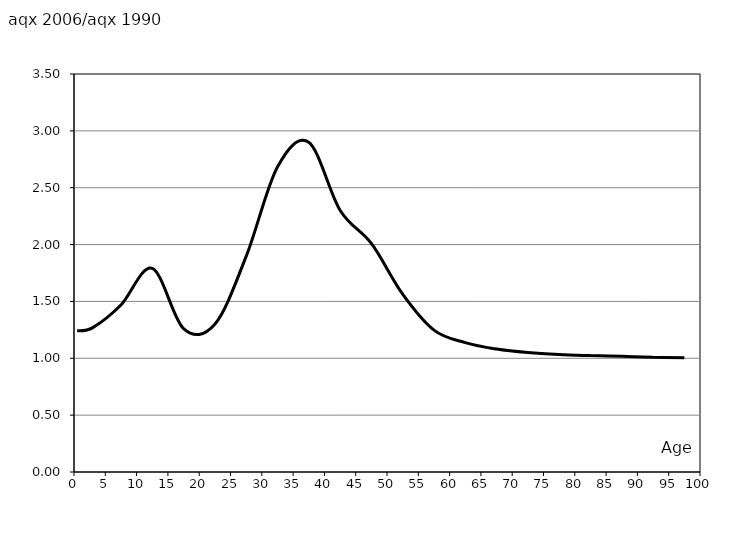
| Category | aqx 2006/aqx 1990 |
|---|---|
| 0.5 | 1.241 |
| 3.0 | 1.27 |
| 7.5 | 1.469 |
| 12.5 | 1.791 |
| 17.5 | 1.261 |
| 22.5 | 1.3 |
| 27.5 | 1.896 |
| 32.5 | 2.682 |
| 37.5 | 2.9 |
| 42.5 | 2.302 |
| 47.5 | 2.01 |
| 52.5 | 1.564 |
| 57.5 | 1.248 |
| 62.5 | 1.138 |
| 67.5 | 1.081 |
| 72.5 | 1.05 |
| 77.5 | 1.033 |
| 82.5 | 1.024 |
| 87.5 | 1.017 |
| 92.5 | 1.009 |
| 97.5 | 1.005 |